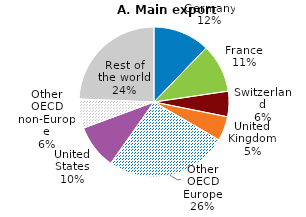
| Category | Series 0 |
|---|---|
| Germany | 12.213 |
| France | 10.471 |
| Switzerland | 5.48 |
| United Kingdom | 5.236 |
| Other OECD Europe | 26.374 |
| United States | 9.582 |
| Other OECD non-Europe | 6.281 |
| Rest of the world | 24.363 |